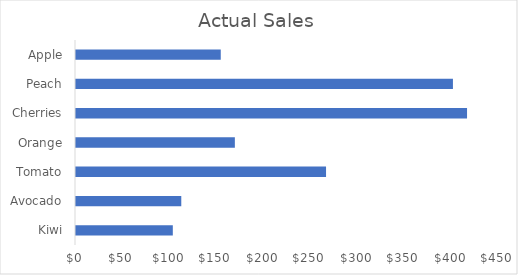
| Category | Actual Sales |
|---|---|
| Kiwi | 103 |
| Avocado | 112 |
| Tomato | 266 |
| Orange | 169 |
| Cherries | 416 |
| Peach | 401 |
| Apple | 154 |